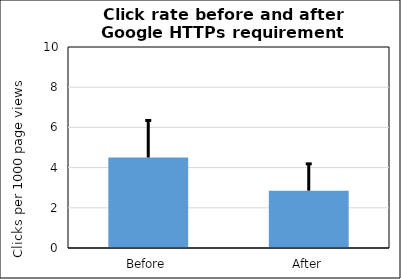
| Category | Series 0 |
|---|---|
| Before | 4.504 |
| After | 2.853 |